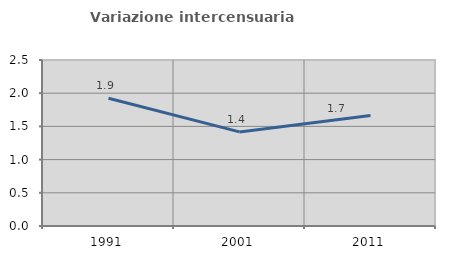
| Category | Variazione intercensuaria annua |
|---|---|
| 1991.0 | 1.923 |
| 2001.0 | 1.417 |
| 2011.0 | 1.666 |